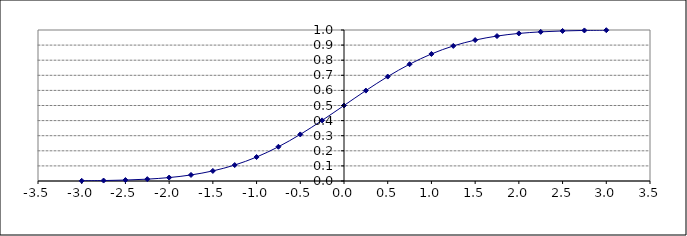
| Category | Series 0 |
|---|---|
| -3.0 | 0.001 |
| -2.75 | 0.003 |
| -2.5 | 0.006 |
| -2.25 | 0.012 |
| -2.0 | 0.023 |
| -1.75 | 0.04 |
| -1.5 | 0.067 |
| -1.25 | 0.106 |
| -1.0 | 0.159 |
| -0.75 | 0.227 |
| -0.5 | 0.309 |
| -0.25 | 0.401 |
| 0.0 | 0.5 |
| 0.25 | 0.599 |
| 0.5 | 0.691 |
| 0.75 | 0.773 |
| 1.0 | 0.841 |
| 1.25 | 0.894 |
| 1.5 | 0.933 |
| 1.75 | 0.96 |
| 2.0 | 0.977 |
| 2.25 | 0.988 |
| 2.5 | 0.994 |
| 2.75 | 0.997 |
| 3.0 | 0.999 |